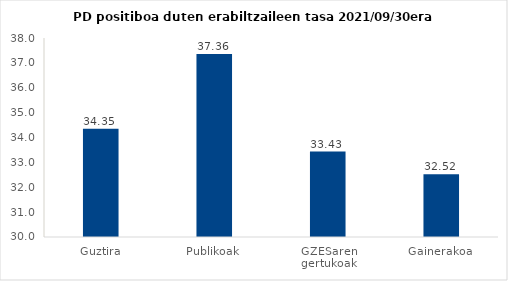
| Category | Series 0 |
|---|---|
| Guztira | 34.355 |
| Publikoak | 37.361 |
| GZESaren gertukoak | 33.434 |
| Gainerakoa | 32.52 |